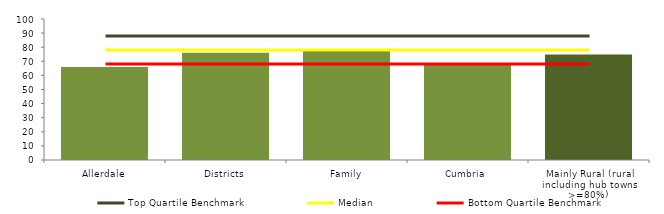
| Category | Block Data |
|---|---|
| Allerdale | 66 |
| Districts | 76.144 |
| Family | 78.125 |
| Cumbria | 68.333 |
| Mainly Rural (rural including hub towns >=80%)  | 74.87 |